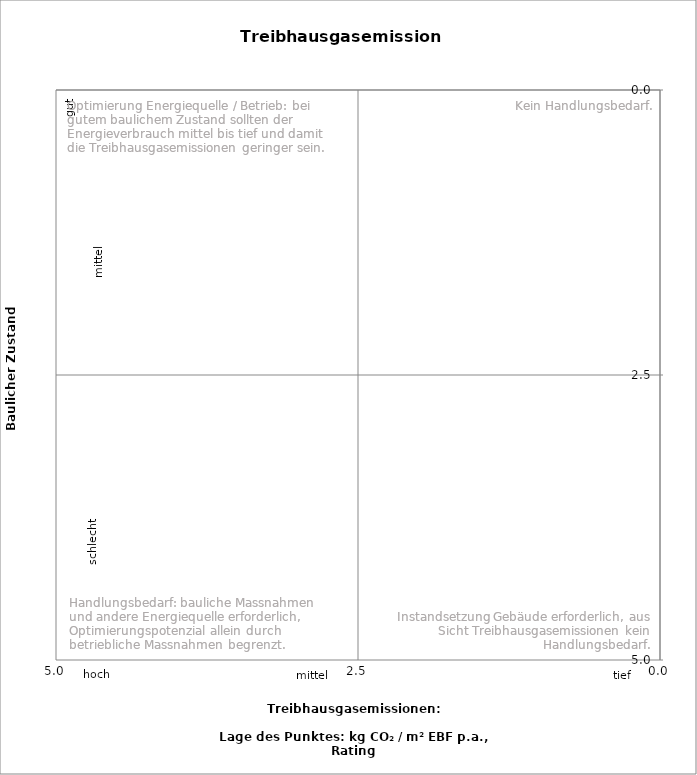
| Category | 1 |
|---|---|
| 0.0 | 0 |
| 0.0 | 0 |
| 0.0 | 0 |
| 0.0 | 0 |
| 0.0 | 0 |
| 0.0 | 0 |
| 0.0 | 0 |
| 0.0 | 0 |
| 0.0 | 0 |
| 0.0 | 0 |
| 0.0 | 0 |
| 0.0 | 0 |
| 0.0 | 0 |
| 0.0 | 0 |
| 0.0 | 0 |